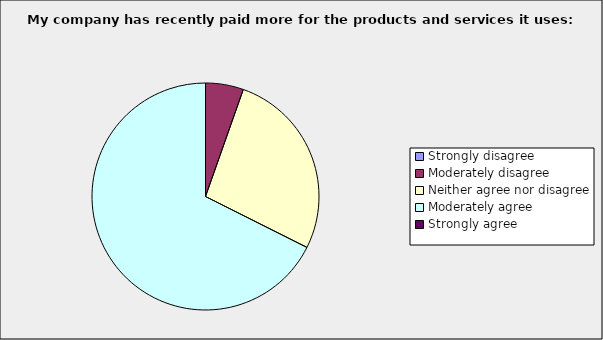
| Category | Series 0 |
|---|---|
| Strongly disagree | 0 |
| Moderately disagree | 0.054 |
| Neither agree nor disagree | 0.27 |
| Moderately agree | 0.676 |
| Strongly agree | 0 |